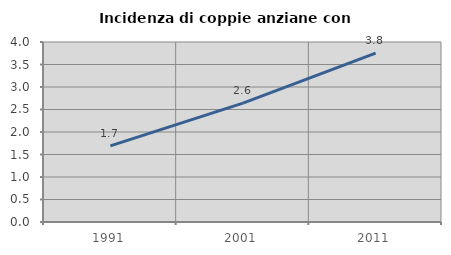
| Category | Incidenza di coppie anziane con figli |
|---|---|
| 1991.0 | 1.691 |
| 2001.0 | 2.641 |
| 2011.0 | 3.754 |